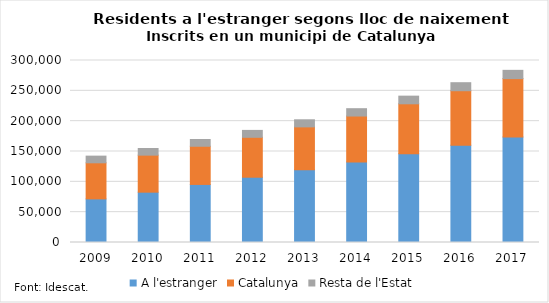
| Category | A l'estranger | Catalunya | Resta de l'Estat |
|---|---|---|---|
| 2009.0 | 71899 | 59463 | 10997 |
| 2010.0 | 82970 | 61035 | 10991 |
| 2011.0 | 95718 | 62925 | 11120 |
| 2012.0 | 107626 | 65791 | 11358 |
| 2013.0 | 120053 | 70535 | 11685 |
| 2014.0 | 132618 | 75842 | 12110 |
| 2015.0 | 146241 | 82378 | 12622 |
| 2016.0 | 160485 | 89701 | 13214 |
| 2017.0 | 173773 | 96379 | 13619 |